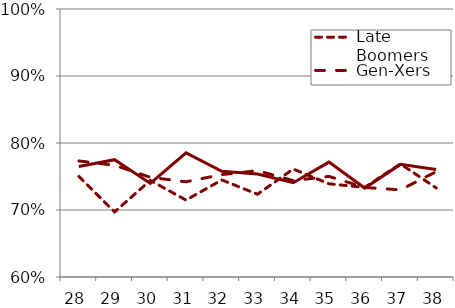
| Category | Late Boomers | Gen-Xers | Millennials |
|---|---|---|---|
| 28.0 | 0.75 | 0.773 | 0.765 |
| 29.0 | 0.697 | 0.767 | 0.775 |
| 30.0 | 0.744 | 0.749 | 0.74 |
| 31.0 | 0.715 | 0.742 | 0.785 |
| 32.0 | 0.745 | 0.753 | 0.758 |
| 33.0 | 0.724 | 0.759 | 0.754 |
| 34.0 | 0.761 | 0.744 | 0.741 |
| 35.0 | 0.739 | 0.75 | 0.771 |
| 36.0 | 0.734 | 0.734 | 0.733 |
| 37.0 | 0.769 | 0.73 | 0.768 |
| 38.0 | 0.733 | 0.757 | 0.76 |